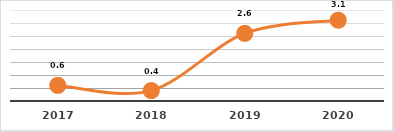
| Category | COBERTURA DE BECADOS EXTERNOS (%)
PRIMER TRIMESTRE, EJERCICIO 2020 |
|---|---|
| 2017.0 | 0.6 |
| 2018.0 | 0.4 |
| 2019.0 | 2.6 |
| 2020.0 | 3.108 |